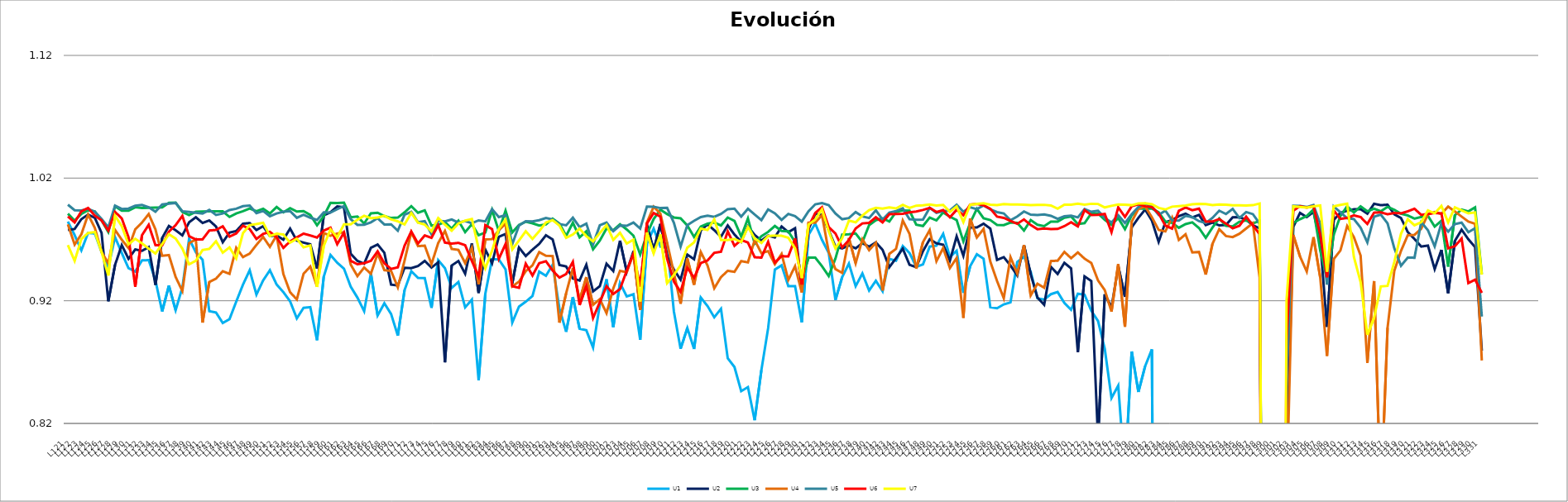
| Category | U1 | U2 | U3 | U4 | U5 | U6 | U7 |
|---|---|---|---|---|---|---|---|
| L121 | 0.984 | 0.978 | 0.991 | 0.982 | 0.998 | 0.989 | 0.965 |
| L122 | 0.973 | 0.978 | 0.985 | 0.966 | 0.994 | 0.984 | 0.952 |
| L123 | 0.961 | 0.987 | 0.991 | 0.974 | 0.994 | 0.993 | 0.97 |
| L124 | 0.975 | 0.99 | 0.994 | 0.99 | 0.995 | 0.996 | 0.975 |
| L125 | 0.975 | 0.988 | 0.993 | 0.979 | 0.993 | 0.989 | 0.976 |
| L126 | 0.96 | 0.975 | 0.985 | 0.96 | 0.987 | 0.986 | 0.96 |
| L127 | 0.947 | 0.92 | 0.976 | 0.951 | 0.98 | 0.977 | 0.941 |
| L128 | 0.972 | 0.949 | 0.997 | 0.978 | 0.998 | 0.992 | 0.989 |
| L129 | 0.959 | 0.965 | 0.993 | 0.97 | 0.995 | 0.987 | 0.981 |
| L130 | 0.947 | 0.954 | 0.993 | 0.963 | 0.995 | 0.972 | 0.966 |
| L131 | 0.944 | 0.962 | 0.996 | 0.978 | 0.997 | 0.931 | 0.97 |
| L132 | 0.953 | 0.961 | 0.996 | 0.984 | 0.998 | 0.973 | 0.967 |
| L133 | 0.953 | 0.964 | 0.996 | 0.991 | 0.996 | 0.982 | 0.962 |
| L134 | 0.937 | 0.933 | 0.996 | 0.978 | 0.993 | 0.965 | 0.959 |
| L135 | 0.911 | 0.971 | 0.996 | 0.957 | 0.998 | 0.965 | 0.966 |
| L136 | 0.932 | 0.981 | 1 | 0.957 | 0.999 | 0.976 | 0.974 |
| L137 | 0.912 | 0.977 | 1 | 0.939 | 1 | 0.982 | 0.971 |
| L138 | 0.931 | 0.973 | 0.992 | 0.928 | 0.993 | 0.989 | 0.963 |
| L139 | 0.97 | 0.984 | 0.99 | 0.967 | 0.992 | 0.973 | 0.95 |
| L140 | 0.96 | 0.988 | 0.993 | 0.97 | 0.992 | 0.97 | 0.953 |
| L141 | 0.953 | 0.983 | 0.993 | 0.902 | 0.991 | 0.97 | 0.961 |
| L142 | 0.912 | 0.985 | 0.993 | 0.935 | 0.994 | 0.977 | 0.962 |
| L143 | 0.91 | 0.981 | 0.993 | 0.938 | 0.99 | 0.978 | 0.969 |
| L144 | 0.902 | 0.968 | 0.993 | 0.944 | 0.991 | 0.981 | 0.959 |
| L145 | 0.905 | 0.976 | 0.988 | 0.942 | 0.994 | 0.972 | 0.963 |
| L146 | 0.919 | 0.977 | 0.991 | 0.963 | 0.995 | 0.975 | 0.954 |
| L147 | 0.933 | 0.983 | 0.993 | 0.956 | 0.997 | 0.981 | 0.975 |
| L148 | 0.945 | 0.983 | 0.995 | 0.958 | 0.998 | 0.978 | 0.982 |
| L149 | 0.925 | 0.978 | 0.993 | 0.966 | 0.991 | 0.97 | 0.983 |
| L150 | 0.937 | 0.981 | 0.995 | 0.972 | 0.993 | 0.975 | 0.984 |
| L151 | 0.945 | 0.973 | 0.991 | 0.964 | 0.989 | 0.976 | 0.973 |
| L152 | 0.933 | 0.973 | 0.996 | 0.973 | 0.991 | 0.972 | 0.975 |
| L153 | 0.927 | 0.97 | 0.992 | 0.942 | 0.993 | 0.963 | 0.974 |
| L154 | 0.92 | 0.979 | 0.996 | 0.927 | 0.993 | 0.968 | 0.967 |
| L155 | 0.906 | 0.969 | 0.993 | 0.921 | 0.988 | 0.972 | 0.97 |
| L156 | 0.914 | 0.967 | 0.993 | 0.942 | 0.99 | 0.975 | 0.964 |
| L157 | 0.915 | 0.966 | 0.99 | 0.948 | 0.988 | 0.973 | 0.965 |
| L158 | 0.888 | 0.946 | 0.982 | 0.932 | 0.986 | 0.972 | 0.931 |
| L159 | 0.94 | 0.99 | 0.989 | 0.975 | 0.992 | 0.977 | 0.965 |
| L160 | 0.957 | 0.992 | 1 | 0.973 | 0.992 | 0.98 | 0.978 |
| L161 | 0.951 | 0.997 | 1 | 0.975 | 0.995 | 0.966 | 0.972 |
| L162 | 0.946 | 0.996 | 1 | 0.976 | 0.997 | 0.976 | 0.982 |
| L163 | 0.932 | 0.958 | 0.988 | 0.95 | 0.987 | 0.953 | 0.982 |
| L164 | 0.923 | 0.952 | 0.989 | 0.94 | 0.982 | 0.95 | 0.986 |
| L165 | 0.911 | 0.95 | 0.983 | 0.947 | 0.982 | 0.951 | 0.989 |
| L166 | 0.942 | 0.963 | 0.991 | 0.942 | 0.984 | 0.953 | 0.987 |
| L167 | 0.908 | 0.966 | 0.992 | 0.958 | 0.987 | 0.96 | 0.988 |
| L168 | 0.918 | 0.959 | 0.989 | 0.945 | 0.982 | 0.951 | 0.989 |
| L169 | 0.909 | 0.933 | 0.987 | 0.944 | 0.982 | 0.946 | 0.986 |
| L170 | 0.892 | 0.932 | 0.988 | 0.931 | 0.977 | 0.947 | 0.985 |
| L171 | 0.929 | 0.947 | 0.992 | 0.953 | 0.99 | 0.965 | 0.982 |
| L172 | 0.944 | 0.947 | 0.997 | 0.976 | 0.993 | 0.977 | 0.992 |
| L173 | 0.939 | 0.948 | 0.992 | 0.965 | 0.984 | 0.967 | 0.984 |
| L174 | 0.938 | 0.952 | 0.994 | 0.965 | 0.985 | 0.973 | 0.982 |
| L175 | 0.914 | 0.947 | 0.981 | 0.95 | 0.974 | 0.971 | 0.977 |
| L176 | 0.953 | 0.951 | 0.982 | 0.967 | 0.985 | 0.982 | 0.987 |
| L177 | 0.947 | 0.87 | 0.984 | 0.977 | 0.985 | 0.967 | 0.982 |
| L178 | 0.931 | 0.949 | 0.979 | 0.962 | 0.986 | 0.967 | 0.977 |
| L179 | 0.935 | 0.952 | 0.985 | 0.961 | 0.984 | 0.967 | 0.983 |
| L180 | 0.915 | 0.942 | 0.976 | 0.951 | 0.985 | 0.965 | 0.985 |
| L181 | 0.921 | 0.967 | 0.982 | 0.963 | 0.983 | 0.952 | 0.987 |
| L182 | 0.855 | 0.926 | 0.973 | 0.933 | 0.986 | 0.94 | 0.963 |
| L183 | 0.926 | 0.962 | 0.976 | 0.97 | 0.985 | 0.982 | 0.946 |
| L184 | 0.954 | 0.951 | 0.994 | 0.97 | 0.995 | 0.978 | 0.961 |
| L185 | 0.954 | 0.972 | 0.977 | 0.978 | 0.988 | 0.954 | 0.979 |
| L186 | 0.946 | 0.974 | 0.993 | 0.983 | 0.99 | 0.966 | 0.986 |
| L187 | 0.902 | 0.934 | 0.976 | 0.932 | 0.966 | 0.932 | 0.962 |
| L188 | 0.915 | 0.963 | 0.982 | 0.936 | 0.981 | 0.931 | 0.969 |
| L189 | 0.919 | 0.956 | 0.984 | 0.944 | 0.985 | 0.95 | 0.977 |
| L190 | 0.924 | 0.962 | 0.983 | 0.949 | 0.985 | 0.941 | 0.97 |
| L191 | 0.944 | 0.966 | 0.981 | 0.96 | 0.986 | 0.951 | 0.977 |
| L192 | 0.94 | 0.973 | 0.982 | 0.957 | 0.987 | 0.952 | 0.984 |
| L193 | 0.949 | 0.97 | 0.987 | 0.956 | 0.986 | 0.945 | 0.986 |
| L194 | 0.914 | 0.949 | 0.983 | 0.902 | 0.983 | 0.939 | 0.981 |
| L195 | 0.895 | 0.948 | 0.973 | 0.926 | 0.982 | 0.942 | 0.971 |
| L196 | 0.923 | 0.938 | 0.984 | 0.947 | 0.988 | 0.952 | 0.974 |
| L197 | 0.897 | 0.936 | 0.972 | 0.921 | 0.98 | 0.917 | 0.979 |
| L198 | 0.896 | 0.949 | 0.977 | 0.939 | 0.983 | 0.932 | 0.973 |
| L199 | 0.882 | 0.928 | 0.962 | 0.917 | 0.966 | 0.906 | 0.968 |
| L200 | 0.917 | 0.932 | 0.969 | 0.921 | 0.981 | 0.919 | 0.975 |
| L201 | 0.938 | 0.95 | 0.979 | 0.91 | 0.984 | 0.932 | 0.982 |
| L202 | 0.899 | 0.944 | 0.977 | 0.93 | 0.977 | 0.926 | 0.97 |
| L203 | 0.934 | 0.969 | 0.982 | 0.944 | 0.981 | 0.93 | 0.975 |
| L204 | 0.923 | 0.944 | 0.978 | 0.943 | 0.981 | 0.944 | 0.967 |
| L205 | 0.925 | 0.96 | 0.973 | 0.958 | 0.984 | 0.959 | 0.97 |
| L206 | 0.888 | 0.913 | 0.958 | 0.912 | 0.979 | 0.932 | 0.919 |
| L207 | 0.967 | 0.982 | 0.974 | 0.984 | 0.997 | 0.983 | 0.976 |
| L208 | 0.979 | 0.961 | 0.987 | 0.997 | 0.997 | 0.992 | 0.959 |
| L209 | 0.964 | 0.983 | 0.994 | 0.991 | 0.996 | 0.989 | 0.974 |
| L210 | 0.967 | 0.956 | 0.991 | 0.967 | 0.996 | 0.954 | 0.934 |
| L211 | 0.911 | 0.945 | 0.988 | 0.943 | 0.984 | 0.936 | 0.941 |
| L212 | 0.881 | 0.937 | 0.987 | 0.918 | 0.964 | 0.927 | 0.949 |
| L213 | 0.898 | 0.958 | 0.981 | 0.954 | 0.982 | 0.947 | 0.963 |
| L214 | 0.881 | 0.954 | 0.972 | 0.933 | 0.985 | 0.939 | 0.968 |
| L215 | 0.923 | 0.977 | 0.981 | 0.96 | 0.988 | 0.951 | 0.979 |
| L216 | 0.916 | 0.982 | 0.983 | 0.949 | 0.989 | 0.953 | 0.978 |
| L217 | 0.907 | 0.978 | 0.984 | 0.93 | 0.988 | 0.959 | 0.986 |
| L218 | 0.913 | 0.972 | 0.981 | 0.939 | 0.991 | 0.96 | 0.969 |
| L219 | 0.873 | 0.981 | 0.988 | 0.944 | 0.995 | 0.977 | 0.97 |
| L220 | 0.866 | 0.974 | 0.985 | 0.944 | 0.995 | 0.965 | 0.97 |
| L221 | 0.846 | 0.968 | 0.972 | 0.952 | 0.989 | 0.97 | 0.968 |
| L222 | 0.85 | 0.981 | 0.987 | 0.951 | 0.995 | 0.967 | 0.98 |
| L223 | 0.823 | 0.974 | 0.967 | 0.969 | 0.99 | 0.955 | 0.971 |
| L224 | 0.863 | 0.969 | 0.973 | 0.959 | 0.986 | 0.955 | 0.967 |
| L225 | 0.898 | 0.973 | 0.976 | 0.96 | 0.994 | 0.968 | 0.973 |
| L226 | 0.945 | 0.972 | 0.981 | 0.95 | 0.991 | 0.951 | 0.973 |
| L227 | 0.949 | 0.981 | 0.977 | 0.958 | 0.986 | 0.956 | 0.973 |
| L228 | 0.932 | 0.976 | 0.977 | 0.937 | 0.991 | 0.956 | 0.971 |
| L229 | 0.932 | 0.979 | 0.968 | 0.948 | 0.989 | 0.971 | 0.963 |
| L230 | 0.902 | 0.929 | 0.937 | 0.927 | 0.985 | 0.933 | 0.938 |
| L231 | 0.974 | 0.978 | 0.955 | 0.984 | 0.993 | 0.98 | 0.982 |
| L232 | 0.983 | 0.991 | 0.955 | 0.984 | 0.999 | 0.992 | 0.986 |
| L233 | 0.97 | 0.99 | 0.948 | 0.99 | 1 | 0.996 | 0.995 |
| L234 | 0.959 | 0.977 | 0.94 | 0.96 | 0.998 | 0.98 | 0.977 |
| L235 | 0.921 | 0.964 | 0.954 | 0.946 | 0.991 | 0.975 | 0.963 |
| L236 | 0.939 | 0.963 | 0.974 | 0.943 | 0.986 | 0.963 | 0.971 |
| L237 | 0.95 | 0.965 | 0.974 | 0.971 | 0.987 | 0.97 | 0.985 |
| L238 | 0.932 | 0.963 | 0.975 | 0.951 | 0.992 | 0.979 | 0.984 |
| L239 | 0.942 | 0.967 | 0.968 | 0.97 | 0.989 | 0.983 | 0.989 |
| L240 | 0.928 | 0.964 | 0.982 | 0.961 | 0.987 | 0.984 | 0.994 |
| L241 | 0.936 | 0.968 | 0.986 | 0.967 | 0.994 | 0.988 | 0.996 |
| L242 | 0.928 | 0.962 | 0.987 | 0.928 | 0.986 | 0.984 | 0.995 |
| L243 | 0.954 | 0.947 | 0.985 | 0.958 | 0.992 | 0.991 | 0.996 |
| L244 | 0.953 | 0.955 | 0.992 | 0.962 | 0.993 | 0.991 | 0.995 |
| L245 | 0.965 | 0.962 | 0.994 | 0.985 | 0.995 | 0.991 | 0.998 |
| L246 | 0.959 | 0.949 | 0.993 | 0.974 | 0.987 | 0.992 | 0.996 |
| L247 | 0.948 | 0.947 | 0.982 | 0.946 | 0.986 | 0.993 | 0.998 |
| L248 | 0.95 | 0.96 | 0.981 | 0.968 | 0.986 | 0.994 | 0.998 |
| L249 | 0.964 | 0.97 | 0.988 | 0.978 | 0.996 | 0.996 | 0.998 |
| L250 | 0.965 | 0.967 | 0.985 | 0.952 | 0.992 | 0.992 | 0.998 |
| L251 | 0.975 | 0.966 | 0.992 | 0.963 | 0.993 | 0.994 | 0.998 |
| L252 | 0.956 | 0.953 | 0.989 | 0.947 | 0.994 | 0.988 | 0.992 |
| L253 | 0.961 | 0.973 | 0.986 | 0.955 | 0.998 | 0.994 | 0.997 |
| L254 | 0.926 | 0.957 | 0.968 | 0.906 | 0.993 | 0.99 | 0.984 |
| L255 | 0.948 | 0.98 | 0.983 | 0.987 | 0.996 | 0.998 | 0.998 |
| L256 | 0.958 | 0.98 | 0.995 | 0.972 | 0.995 | 0.999 | 0.999 |
| L257 | 0.954 | 0.983 | 0.987 | 0.979 | 0.998 | 0.998 | 1 |
| L258 | 0.915 | 0.979 | 0.986 | 0.952 | 0.994 | 0.995 | 0.998 |
| L259 | 0.914 | 0.953 | 0.982 | 0.936 | 0.992 | 0.989 | 0.998 |
| L260 | 0.917 | 0.956 | 0.982 | 0.922 | 0.991 | 0.988 | 0.999 |
| L261 | 0.919 | 0.949 | 0.984 | 0.956 | 0.986 | 0.985 | 0.998 |
| L262 | 0.952 | 0.941 | 0.983 | 0.942 | 0.989 | 0.983 | 0.999 |
| L263 | 0.956 | 0.965 | 0.977 | 0.965 | 0.993 | 0.986 | 0.998 |
| L264 | 0.944 | 0.942 | 0.986 | 0.924 | 0.99 | 0.982 | 0.998 |
| L265 | 0.922 | 0.923 | 0.982 | 0.934 | 0.99 | 0.978 | 0.998 |
| L266 | 0.921 | 0.917 | 0.981 | 0.931 | 0.99 | 0.979 | 0.998 |
| L267 | 0.925 | 0.948 | 0.984 | 0.952 | 0.989 | 0.978 | 0.998 |
| L268 | 0.927 | 0.942 | 0.985 | 0.953 | 0.987 | 0.979 | 0.995 |
| L269 | 0.918 | 0.951 | 0.988 | 0.96 | 0.989 | 0.981 | 0.998 |
| L270 | 0.913 | 0.946 | 0.989 | 0.955 | 0.989 | 0.984 | 0.998 |
| L271 | 0.926 | 0.878 | 0.983 | 0.959 | 0.988 | 0.981 | 0.999 |
| L272 | 0.925 | 0.94 | 0.983 | 0.954 | 0.995 | 0.994 | 0.998 |
| L273 | 0.912 | 0.936 | 0.991 | 0.951 | 0.993 | 0.99 | 0.999 |
| L274 | 0.903 | 0.807 | 0.991 | 0.937 | 0.993 | 0.99 | 0.999 |
| L275 | 0.881 | 0.925 | 0.986 | 0.929 | 0.988 | 0.991 | 0.996 |
| L276 | 0.841 | 0.914 | 0.982 | 0.911 | 0.984 | 0.976 | 0.997 |
| L277 | 0.851 | 0.948 | 0.987 | 0.95 | 0.99 | 0.996 | 0.998 |
| L278 | 0.778 | 0.923 | 0.978 | 0.899 | 0.983 | 0.988 | 0.998 |
| L279 | 0.879 | 0.98 | 0.99 | 0.985 | 0.991 | 0.997 | 0.998 |
| L280 | 0.846 | 0.988 | 0.995 | 0.995 | 0.996 | 0.999 | 0.999 |
| L281 | 0.867 | 0.994 | 0.995 | 0.997 | 0.999 | 0.997 | 0.999 |
| L282 | 0.88 | 0.985 | 0.995 | 0.988 | 0.997 | 0.996 | 0.999 |
| L283 | 0 | 0.968 | 0.992 | 0.978 | 0.99 | 0.991 | 0.996 |
| L284 | 0 | 0.984 | 0.985 | 0.976 | 0.993 | 0.981 | 0.994 |
| L285 | 0 | 0.986 | 0.984 | 0.988 | 0.986 | 0.979 | 0.997 |
| L286 | 0 | 0.989 | 0.98 | 0.97 | 0.985 | 0.993 | 0.997 |
| L287 | 0 | 0.991 | 0.982 | 0.974 | 0.989 | 0.996 | 0.998 |
| L288 | 0 | 0.988 | 0.984 | 0.959 | 0.988 | 0.994 | 0.999 |
| L289 | 0 | 0.99 | 0.979 | 0.96 | 0.985 | 0.995 | 0.999 |
| L290 | 0 | 0.982 | 0.971 | 0.941 | 0.983 | 0.985 | 0.999 |
| L291 | 0 | 0.984 | 0.98 | 0.966 | 0.988 | 0.985 | 0.998 |
| L292 | 0 | 0.981 | 0.987 | 0.978 | 0.993 | 0.987 | 0.998 |
| L293 | 0 | 0.982 | 0.981 | 0.973 | 0.991 | 0.983 | 0.998 |
| L294 | 0 | 0.988 | 0.981 | 0.972 | 0.995 | 0.979 | 0.998 |
| L295 | 0 | 0.988 | 0.984 | 0.975 | 0.988 | 0.981 | 0.998 |
| L296 | 0 | 0.986 | 0.985 | 0.979 | 0.992 | 0.988 | 0.998 |
| L297 | 0 | 0.982 | 0.983 | 0.983 | 0.991 | 0.981 | 0.998 |
| L298 | 0 | 0.979 | 0.985 | 0.939 | 0.983 | 0.974 | 0.999 |
| L299 | 0 | 0 | 0 | 0 | 0 | 0 | 0 |
| L300 | 0 | 0 | 0 | 0 | 0 | 0 | 0 |
| L301 | 0 | 0 | 0 | 0 | 0 | 0 | 0 |
| L302 | 0 | 0.787 | 0.862 | 0.76 | 0.856 | 0.887 | 0.921 |
| L303 | 0 | 0.98 | 0.983 | 0.974 | 0.997 | 0.993 | 0.997 |
| L304 | 0 | 0.992 | 0.986 | 0.956 | 0.997 | 0.997 | 0.997 |
| L305 | 0 | 0.988 | 0.989 | 0.944 | 0.996 | 0.996 | 0.996 |
| L306 | 0 | 0.992 | 0.994 | 0.972 | 0.998 | 0.997 | 0.997 |
| L307 | 0 | 0.969 | 0.961 | 0.939 | 0.983 | 0.974 | 0.998 |
| L308 | 0 | 0.899 | 0.938 | 0.875 | 0.933 | 0.939 | 0.944 |
| L309 | 0 | 0.986 | 0.974 | 0.954 | 0.997 | 0.994 | 0.997 |
| L310 | 0 | 0.992 | 0.989 | 0.961 | 0.992 | 0.987 | 0.998 |
| L311 | 0 | 0.993 | 0.997 | 0.981 | 0.987 | 0.988 | 0.999 |
| L312 | 0 | 0.995 | 0.992 | 0.972 | 0.987 | 0.99 | 0.956 |
| L313 | 0 | 0.995 | 0.997 | 0.957 | 0.98 | 0.988 | 0.935 |
| L314 | 0 | 0.991 | 0.993 | 0.869 | 0.968 | 0.983 | 0.892 |
| L315 | 0 | 0.999 | 0.995 | 0.936 | 0.989 | 0.992 | 0.906 |
| L316 | 0 | 0.998 | 0.993 | 0.756 | 0.99 | 0.992 | 0.932 |
| L317 | 0 | 0.998 | 0.997 | 0.898 | 0.983 | 0.991 | 0.932 |
| L318 | 0 | 0.99 | 0.994 | 0.944 | 0.963 | 0.992 | 0.952 |
| L319 | 0 | 0.987 | 0.991 | 0.961 | 0.949 | 0.991 | 0.975 |
| L320 | 0 | 0.976 | 0.99 | 0.973 | 0.955 | 0.993 | 0.986 |
| L321 | 0 | 0.97 | 0.987 | 0.974 | 0.955 | 0.995 | 0.982 |
| L322 | 0 | 0.964 | 0.988 | 0.979 | 0.984 | 0.99 | 0.984 |
| L323 | 0 | 0.965 | 0.989 | 0.99 | 0.977 | 0.991 | 0.994 |
| L324 | 0 | 0.946 | 0.98 | 0.992 | 0.964 | 0.992 | 0.991 |
| L325 | 0 | 0.962 | 0.985 | 0.991 | 0.983 | 0.991 | 0.997 |
| L326 | 0 | 0.926 | 0.948 | 0.997 | 0.976 | 0.963 | 0.984 |
| L327 | 0 | 0.969 | 0.99 | 0.993 | 0.982 | 0.964 | 0.996 |
| L328 | 0 | 0.978 | 0.994 | 0.989 | 0.984 | 0.971 | 0.994 |
| L329 | 0 | 0.97 | 0.993 | 0.985 | 0.976 | 0.934 | 0.991 |
| L330 | 0 | 0.964 | 0.996 | 0.983 | 0.979 | 0.937 | 0.992 |
| L331 | 0 | 0.879 | 0.942 | 0.871 | 0.907 | 0.926 | 0.941 |